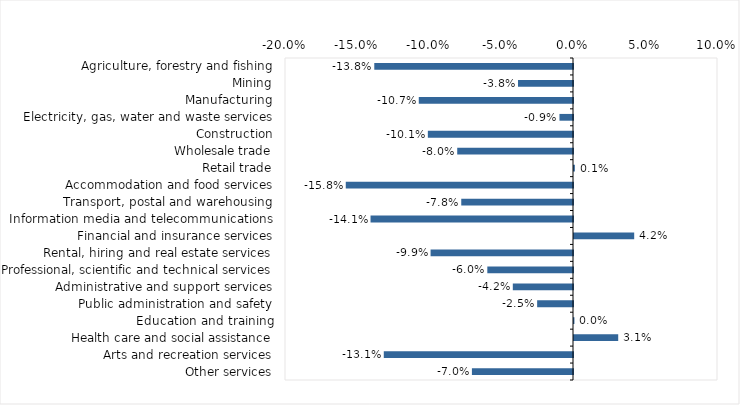
| Category | This week |
|---|---|
| Agriculture, forestry and fishing | -0.138 |
| Mining | -0.038 |
| Manufacturing | -0.107 |
| Electricity, gas, water and waste services | -0.009 |
| Construction | -0.101 |
| Wholesale trade | -0.08 |
| Retail trade | 0.001 |
| Accommodation and food services | -0.158 |
| Transport, postal and warehousing | -0.078 |
| Information media and telecommunications | -0.141 |
| Financial and insurance services | 0.042 |
| Rental, hiring and real estate services | -0.099 |
| Professional, scientific and technical services | -0.06 |
| Administrative and support services | -0.042 |
| Public administration and safety | -0.025 |
| Education and training | 0 |
| Health care and social assistance | 0.031 |
| Arts and recreation services | -0.131 |
| Other services | -0.07 |